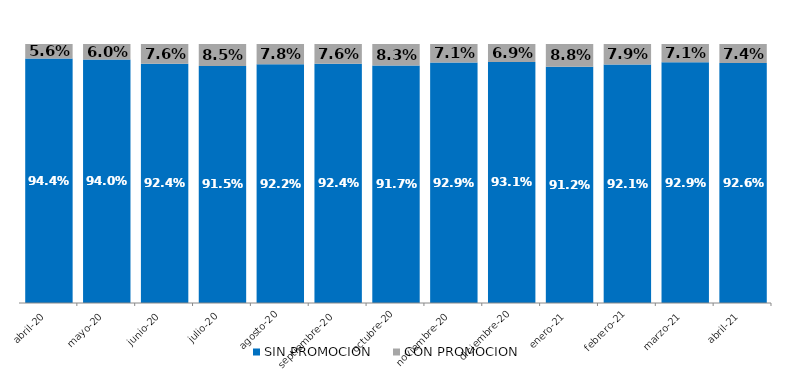
| Category | SIN PROMOCION   | CON PROMOCION   |
|---|---|---|
| 2020-04-01 | 0.944 | 0.056 |
| 2020-05-01 | 0.94 | 0.06 |
| 2020-06-01 | 0.924 | 0.076 |
| 2020-07-01 | 0.915 | 0.085 |
| 2020-08-01 | 0.922 | 0.078 |
| 2020-09-01 | 0.924 | 0.076 |
| 2020-10-01 | 0.917 | 0.083 |
| 2020-11-01 | 0.929 | 0.071 |
| 2020-12-01 | 0.931 | 0.069 |
| 2021-01-01 | 0.912 | 0.088 |
| 2021-02-01 | 0.921 | 0.079 |
| 2021-03-01 | 0.929 | 0.071 |
| 2021-04-01 | 0.926 | 0.074 |